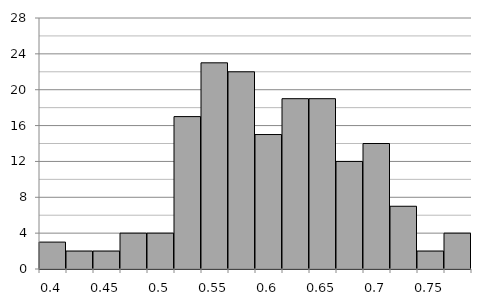
| Category | Survey Proportion |
|---|---|
| 0.4 | 3 |
| 0.425 | 2 |
| 0.45 | 2 |
| 0.475 | 4 |
| 0.5 | 4 |
| 0.525 | 17 |
| 0.55 | 23 |
| 0.575 | 22 |
| 0.6 | 15 |
| 0.625 | 19 |
| 0.65 | 19 |
| 0.675 | 12 |
| 0.7 | 14 |
| 0.725 | 7 |
| 0.75 | 2 |
| 0.775 | 4 |